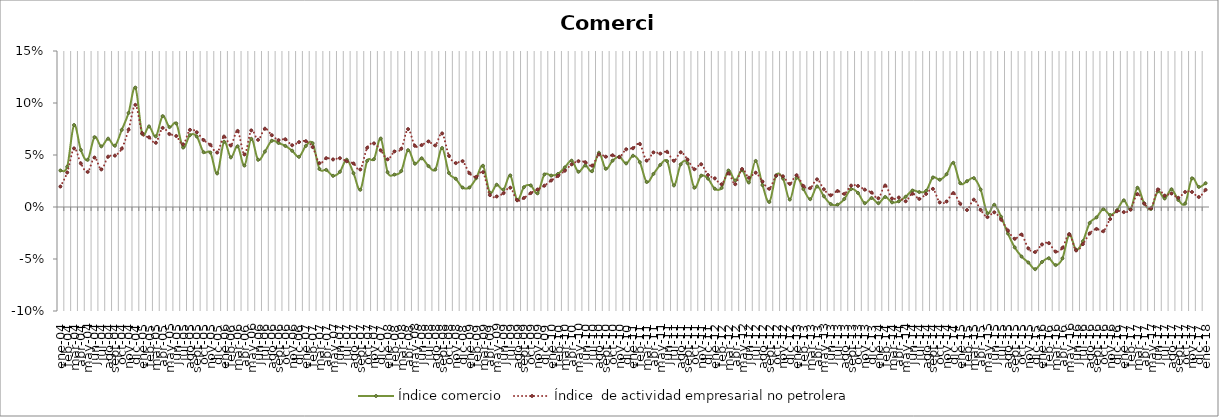
| Category | Índice comercio | Índice  de actividad empresarial no petrolera |
|---|---|---|
| 2004-01-01 | 0.035 | 0.02 |
| 2004-02-01 | 0.039 | 0.033 |
| 2004-03-01 | 0.079 | 0.056 |
| 2004-04-01 | 0.055 | 0.042 |
| 2004-05-01 | 0.045 | 0.034 |
| 2004-06-01 | 0.067 | 0.048 |
| 2004-07-01 | 0.058 | 0.036 |
| 2004-08-01 | 0.066 | 0.048 |
| 2004-09-01 | 0.059 | 0.049 |
| 2004-10-01 | 0.074 | 0.056 |
| 2004-11-01 | 0.09 | 0.074 |
| 2004-12-01 | 0.115 | 0.098 |
| 2005-01-01 | 0.07 | 0.071 |
| 2005-02-01 | 0.077 | 0.067 |
| 2005-03-01 | 0.068 | 0.062 |
| 2005-04-01 | 0.087 | 0.076 |
| 2005-05-01 | 0.077 | 0.07 |
| 2005-06-01 | 0.08 | 0.068 |
| 2005-07-01 | 0.057 | 0.06 |
| 2005-08-01 | 0.069 | 0.074 |
| 2005-09-01 | 0.068 | 0.072 |
| 2005-10-01 | 0.053 | 0.064 |
| 2005-11-01 | 0.052 | 0.06 |
| 2005-12-01 | 0.032 | 0.052 |
| 2006-01-01 | 0.063 | 0.068 |
| 2006-02-01 | 0.048 | 0.059 |
| 2006-03-01 | 0.058 | 0.073 |
| 2006-04-01 | 0.04 | 0.051 |
| 2006-05-01 | 0.066 | 0.074 |
| 2006-06-01 | 0.045 | 0.065 |
| 2006-07-01 | 0.053 | 0.075 |
| 2006-08-01 | 0.064 | 0.069 |
| 2006-09-01 | 0.062 | 0.064 |
| 2006-10-01 | 0.059 | 0.065 |
| 2006-11-01 | 0.054 | 0.059 |
| 2006-12-01 | 0.048 | 0.062 |
| 2007-01-01 | 0.059 | 0.063 |
| 2007-02-01 | 0.061 | 0.058 |
| 2007-03-01 | 0.037 | 0.042 |
| 2007-04-01 | 0.036 | 0.047 |
| 2007-05-01 | 0.03 | 0.046 |
| 2007-06-01 | 0.034 | 0.047 |
| 2007-07-01 | 0.045 | 0.044 |
| 2007-08-01 | 0.033 | 0.042 |
| 2007-09-01 | 0.017 | 0.036 |
| 2007-10-01 | 0.044 | 0.057 |
| 2007-11-01 | 0.046 | 0.061 |
| 2007-12-01 | 0.066 | 0.054 |
| 2008-01-01 | 0.033 | 0.046 |
| 2008-02-01 | 0.031 | 0.053 |
| 2008-03-01 | 0.035 | 0.056 |
| 2008-04-01 | 0.055 | 0.075 |
| 2008-05-01 | 0.042 | 0.059 |
| 2008-06-01 | 0.047 | 0.06 |
| 2008-07-01 | 0.039 | 0.063 |
| 2008-08-01 | 0.036 | 0.059 |
| 2008-09-01 | 0.057 | 0.071 |
| 2008-10-01 | 0.033 | 0.049 |
| 2008-11-01 | 0.027 | 0.042 |
| 2008-12-01 | 0.019 | 0.044 |
| 2009-01-01 | 0.019 | 0.033 |
| 2009-02-01 | 0.028 | 0.029 |
| 2009-03-01 | 0.04 | 0.033 |
| 2009-04-01 | 0.014 | 0.012 |
| 2009-05-01 | 0.021 | 0.01 |
| 2009-06-01 | 0.017 | 0.013 |
| 2009-07-01 | 0.03 | 0.019 |
| 2009-08-01 | 0.007 | 0.006 |
| 2009-09-01 | 0.019 | 0.009 |
| 2009-10-01 | 0.021 | 0.013 |
| 2009-11-01 | 0.013 | 0.017 |
| 2009-12-01 | 0.031 | 0.02 |
| 2010-01-01 | 0.03 | 0.026 |
| 2010-02-01 | 0.032 | 0.03 |
| 2010-03-01 | 0.038 | 0.035 |
| 2010-04-01 | 0.045 | 0.041 |
| 2010-05-01 | 0.034 | 0.044 |
| 2010-06-01 | 0.04 | 0.043 |
| 2010-07-01 | 0.034 | 0.04 |
| 2010-08-01 | 0.052 | 0.051 |
| 2010-09-01 | 0.037 | 0.048 |
| 2010-10-01 | 0.045 | 0.05 |
| 2010-11-01 | 0.048 | 0.048 |
| 2010-12-01 | 0.042 | 0.055 |
| 2011-01-01 | 0.049 | 0.057 |
| 2011-02-01 | 0.043 | 0.061 |
| 2011-03-01 | 0.024 | 0.045 |
| 2011-04-01 | 0.032 | 0.053 |
| 2011-05-01 | 0.04 | 0.051 |
| 2011-06-01 | 0.044 | 0.053 |
| 2011-07-01 | 0.021 | 0.044 |
| 2011-08-01 | 0.041 | 0.053 |
| 2011-09-01 | 0.042 | 0.046 |
| 2011-10-01 | 0.019 | 0.036 |
| 2011-11-01 | 0.03 | 0.041 |
| 2011-12-01 | 0.027 | 0.031 |
| 2012-01-01 | 0.018 | 0.028 |
| 2012-02-01 | 0.018 | 0.022 |
| 2012-03-01 | 0.035 | 0.032 |
| 2012-04-01 | 0.025 | 0.022 |
| 2012-05-01 | 0.035 | 0.037 |
| 2012-06-01 | 0.024 | 0.028 |
| 2012-07-01 | 0.044 | 0.033 |
| 2012-08-01 | 0.021 | 0.024 |
| 2012-09-01 | 0.005 | 0.018 |
| 2012-10-01 | 0.03 | 0.03 |
| 2012-11-01 | 0.027 | 0.03 |
| 2012-12-01 | 0.007 | 0.022 |
| 2013-01-01 | 0.028 | 0.031 |
| 2013-02-01 | 0.017 | 0.02 |
| 2013-03-01 | 0.008 | 0.018 |
| 2013-04-01 | 0.02 | 0.027 |
| 2013-05-01 | 0.01 | 0.017 |
| 2013-06-01 | 0.003 | 0.011 |
| 2013-07-01 | 0.002 | 0.015 |
| 2013-08-01 | 0.008 | 0.013 |
| 2013-09-01 | 0.017 | 0.021 |
| 2013-10-01 | 0.014 | 0.02 |
| 2013-11-01 | 0.004 | 0.017 |
| 2013-12-01 | 0.009 | 0.014 |
| 2014-01-01 | 0.004 | 0.008 |
| 2014-02-01 | 0.01 | 0.021 |
| 2014-03-01 | 0.004 | 0.008 |
| 2014-04-01 | 0.005 | 0.009 |
| 2014-05-01 | 0.01 | 0.006 |
| 2014-06-01 | 0.016 | 0.013 |
| 2014-07-01 | 0.014 | 0.008 |
| 2014-08-01 | 0.016 | 0.013 |
| 2014-09-01 | 0.028 | 0.017 |
| 2014-10-01 | 0.026 | 0.004 |
| 2014-11-01 | 0.032 | 0.005 |
| 2014-12-01 | 0.042 | 0.013 |
| 2015-01-01 | 0.023 | 0.003 |
| 2015-02-01 | 0.025 | -0.003 |
| 2015-03-01 | 0.028 | 0.007 |
| 2015-04-01 | 0.017 | -0.003 |
| 2015-05-01 | -0.006 | -0.01 |
| 2015-06-01 | 0.002 | -0.005 |
| 2015-07-01 | -0.009 | -0.012 |
| 2015-08-01 | -0.025 | -0.023 |
| 2015-09-01 | -0.039 | -0.031 |
| 2015-10-01 | -0.048 | -0.026 |
| 2015-11-01 | -0.053 | -0.04 |
| 2015-12-01 | -0.06 | -0.043 |
| 2016-01-01 | -0.053 | -0.036 |
| 2016-02-01 | -0.049 | -0.035 |
| 2016-03-01 | -0.056 | -0.043 |
| 2016-04-01 | -0.049 | -0.039 |
| 2016-05-01 | -0.027 | -0.026 |
| 2016-06-01 | -0.041 | -0.042 |
| 2016-07-01 | -0.033 | -0.036 |
| 2016-08-01 | -0.015 | -0.025 |
| 2016-09-01 | -0.01 | -0.021 |
| 2016-10-01 | -0.002 | -0.023 |
| 2016-11-01 | -0.008 | -0.012 |
| 2016-12-01 | -0.003 | -0.004 |
| 2017-01-01 | 0.006 | -0.005 |
| 2017-02-01 | -0.002 | -0.003 |
| 2017-03-01 | 0.019 | 0.012 |
| 2017-04-01 | 0.003 | 0.003 |
| 2017-05-01 | -0.002 | -0.001 |
| 2017-06-01 | 0.015 | 0.017 |
| 2017-07-01 | 0.008 | 0.011 |
| 2017-08-01 | 0.017 | 0.013 |
| 2017-09-01 | 0.007 | 0.009 |
| 2017-10-01 | 0.003 | 0.014 |
| 2017-11-01 | 0.028 | 0.014 |
| 2017-12-01 | 0.019 | 0.01 |
| 2018-01-01 | 0.023 | 0.016 |